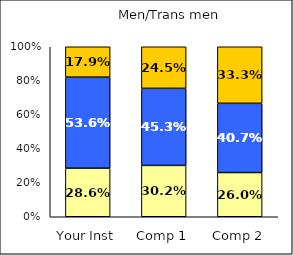
| Category | Low Scholarly Productivity | Average Scholarly Productivity | High Scholarly Productivity |
|---|---|---|---|
| Your Inst | 0.286 | 0.536 | 0.179 |
| Comp 1 | 0.302 | 0.453 | 0.245 |
| Comp 2 | 0.26 | 0.407 | 0.333 |